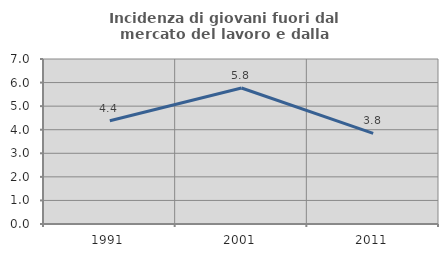
| Category | Incidenza di giovani fuori dal mercato del lavoro e dalla formazione  |
|---|---|
| 1991.0 | 4.38 |
| 2001.0 | 5.769 |
| 2011.0 | 3.846 |